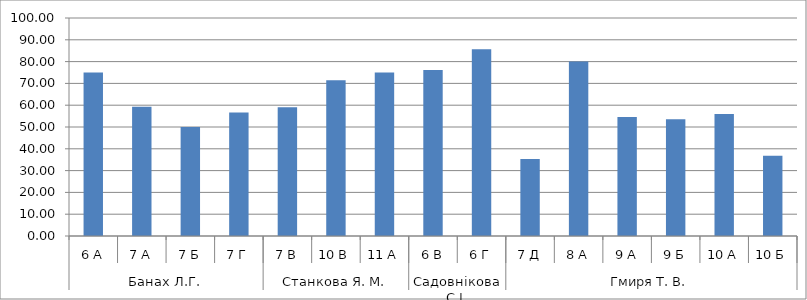
| Category | Series 0 |
|---|---|
| 0 | 75 |
| 1 | 59.259 |
| 2 | 50 |
| 3 | 56.667 |
| 4 | 59.091 |
| 5 | 71.429 |
| 6 | 75 |
| 7 | 76.19 |
| 8 | 85.714 |
| 9 | 35.294 |
| 10 | 80 |
| 11 | 54.545 |
| 12 | 53.571 |
| 13 | 56 |
| 14 | 36.842 |